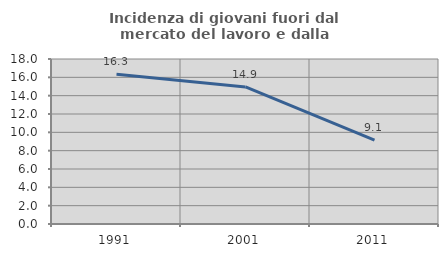
| Category | Incidenza di giovani fuori dal mercato del lavoro e dalla formazione  |
|---|---|
| 1991.0 | 16.327 |
| 2001.0 | 14.948 |
| 2011.0 | 9.143 |